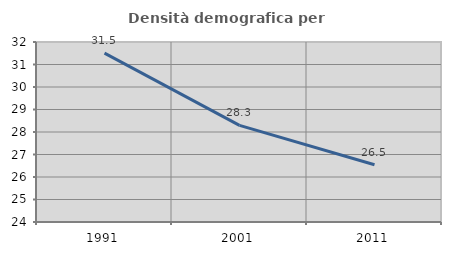
| Category | Densità demografica |
|---|---|
| 1991.0 | 31.503 |
| 2001.0 | 28.294 |
| 2011.0 | 26.544 |